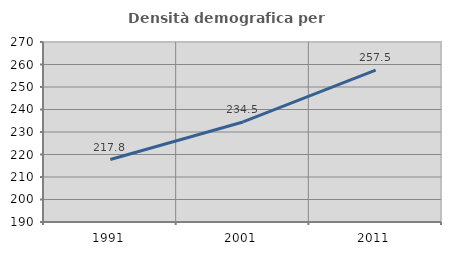
| Category | Densità demografica |
|---|---|
| 1991.0 | 217.766 |
| 2001.0 | 234.461 |
| 2011.0 | 257.485 |